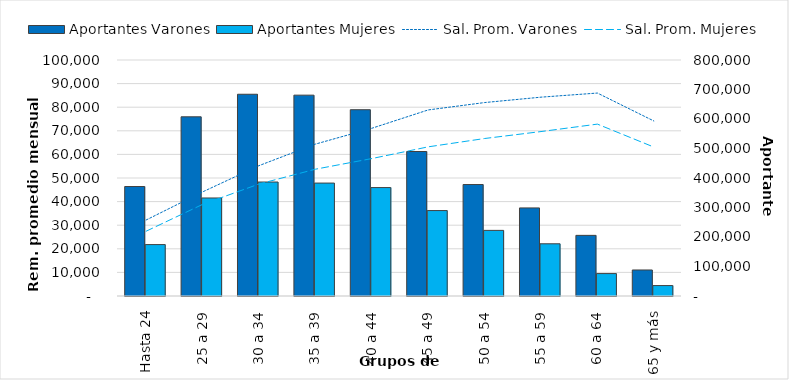
| Category | Aportantes Varones | Aportantes Mujeres |
|---|---|---|
| Hasta 24 | 371093 | 174306 |
| 25 a 29 | 607426 | 332292 |
| 30 a 34 | 683888 | 386381 |
| 35 a 39 | 680838 | 382833 |
| 40 a 44 | 631471 | 367575 |
| 45 a 49 | 489805 | 289609 |
| 50 a 54 | 377811 | 222446 |
| 55 a 59 | 298608 | 176993 |
| 60 a 64 | 205559 | 75999 |
| 65 y más | 88231 | 35373 |